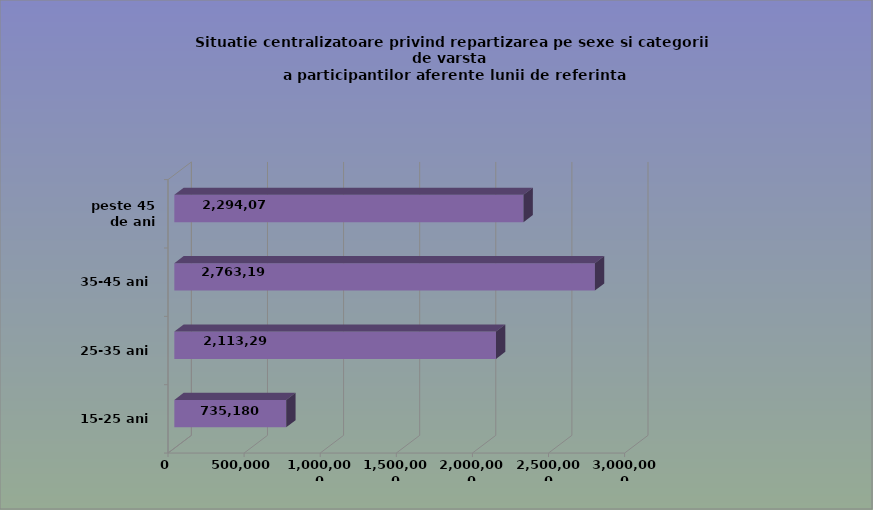
| Category | 15-25 ani 25-35 ani 35-45 ani peste 45 de ani |
|---|---|
| 15-25 ani | 735180 |
| 25-35 ani | 2113291 |
| 35-45 ani | 2763197 |
| peste 45 de ani | 2294075 |